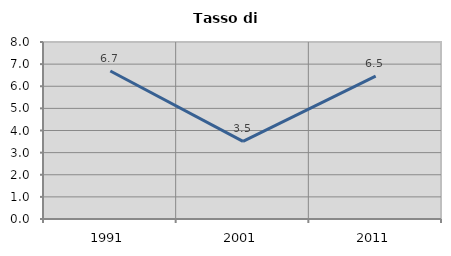
| Category | Tasso di disoccupazione   |
|---|---|
| 1991.0 | 6.687 |
| 2001.0 | 3.51 |
| 2011.0 | 6.456 |